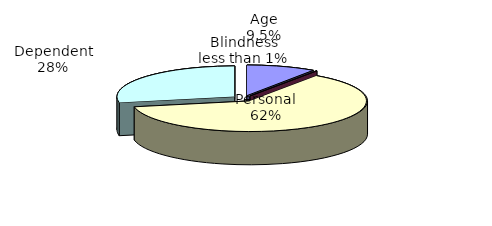
| Category | Series 0 |
|---|---|
| Age | 802660 |
| Blindness | 8722 |
| Personal | 5250876 |
| Dependent | 2367035 |